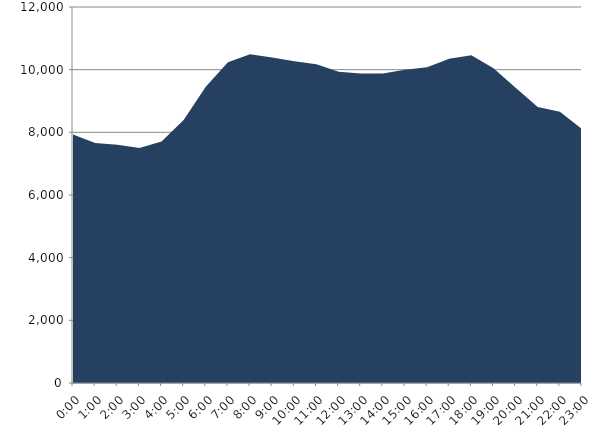
| Category | Series 0 | Series 1 |
|---|---|---|
| 2022-02-16 |  | 7931.198 |
| 2022-02-16 01:00:00 |  | 7660.615 |
| 2022-02-16 02:00:00 |  | 7605.502 |
| 2022-02-16 03:00:00 |  | 7501.934 |
| 2022-02-16 04:00:00 |  | 7705.373 |
| 2022-02-16 05:00:00 |  | 8390.817 |
| 2022-02-16 06:00:00 |  | 9451.497 |
| 2022-02-16 07:00:00 |  | 10236.165 |
| 2022-02-16 08:00:00 |  | 10488.703 |
| 2022-02-16 09:00:00 |  | 10391.915 |
| 2022-02-16 10:00:00 |  | 10266.175 |
| 2022-02-16 11:00:00 |  | 10173.542 |
| 2022-02-16 12:00:00 |  | 9936.281 |
| 2022-02-16 13:00:00 |  | 9880.292 |
| 2022-02-16 14:00:00 |  | 9878.035 |
| 2022-02-16 15:00:00 |  | 9994.769 |
| 2022-02-16 16:00:00 |  | 10080.616 |
| 2022-02-16 17:00:00 |  | 10351.623 |
| 2022-02-16 18:00:00 |  | 10462.547 |
| 2022-02-16 19:00:00 |  | 10045.991 |
| 2022-02-16 20:00:00 |  | 9420.056 |
| 2022-02-16 21:00:00 |  | 8807.682 |
| 2022-02-16 22:00:00 |  | 8655.406 |
| 2022-02-16 23:00:00 |  | 8105.211 |